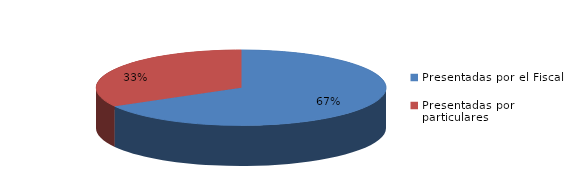
| Category | Series 0 |
|---|---|
| Presentadas por el Fiscal | 171 |
| Presentadas por particulares | 85 |